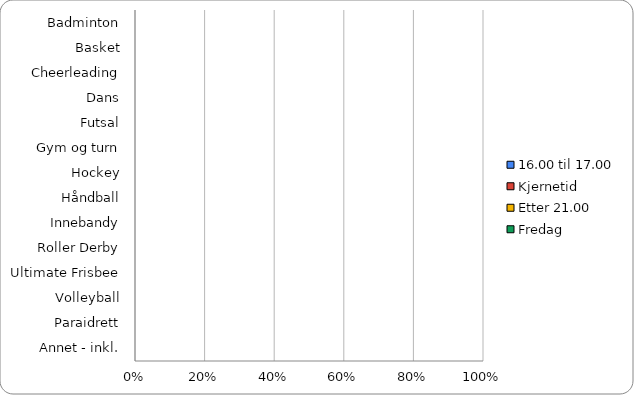
| Category | 16.00 til 17.00 | Kjernetid | Etter 21.00 | Fredag |
|---|---|---|---|---|
| Badminton | 0 | 0 | 0 | 0 |
| Basket | 0 | 0 | 0 | 0 |
| Cheerleading | 0 | 0 | 0 | 0 |
| Dans | 0 | 0 | 0 | 0 |
| Futsal | 0 | 0 | 0 | 0 |
| Gym og turn | 0 | 0 | 0 | 0 |
| Hockey | 0 | 0 | 0 | 0 |
| Håndball | 0 | 0 | 0 | 0 |
| Innebandy | 0 | 0 | 0 | 0 |
| Roller Derby | 0 | 0 | 0 | 0 |
| Ultimate Frisbee | 0 | 0 | 0 | 0 |
| Volleyball | 0 | 0 | 0 | 0 |
| Paraidrett | 0 | 0 | 0 | 0 |
| Annet - inkl. | 0 | 0 | 0 | 0 |